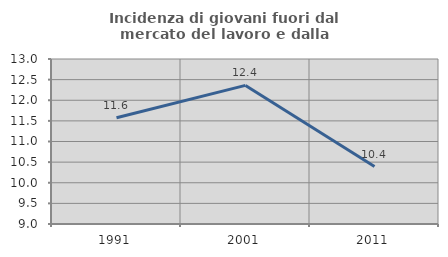
| Category | Incidenza di giovani fuori dal mercato del lavoro e dalla formazione  |
|---|---|
| 1991.0 | 11.575 |
| 2001.0 | 12.36 |
| 2011.0 | 10.392 |